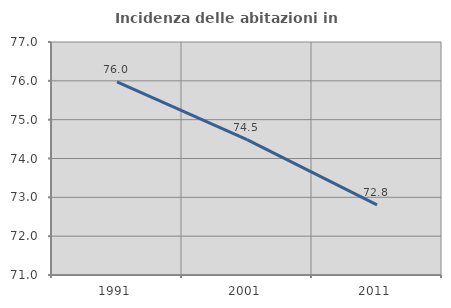
| Category | Incidenza delle abitazioni in proprietà  |
|---|---|
| 1991.0 | 75.976 |
| 2001.0 | 74.487 |
| 2011.0 | 72.804 |